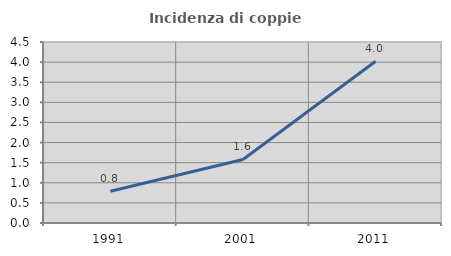
| Category | Incidenza di coppie miste |
|---|---|
| 1991.0 | 0.789 |
| 2001.0 | 1.579 |
| 2011.0 | 4.021 |